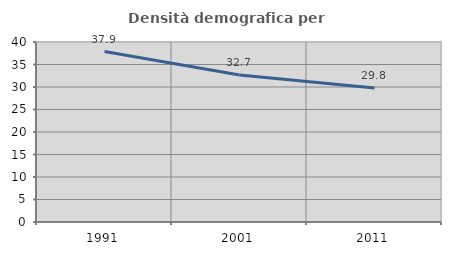
| Category | Densità demografica |
|---|---|
| 1991.0 | 37.874 |
| 2001.0 | 32.653 |
| 2011.0 | 29.801 |